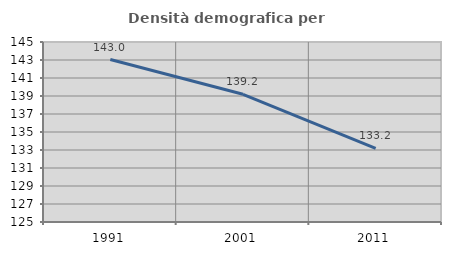
| Category | Densità demografica |
|---|---|
| 1991.0 | 143.048 |
| 2001.0 | 139.186 |
| 2011.0 | 133.172 |